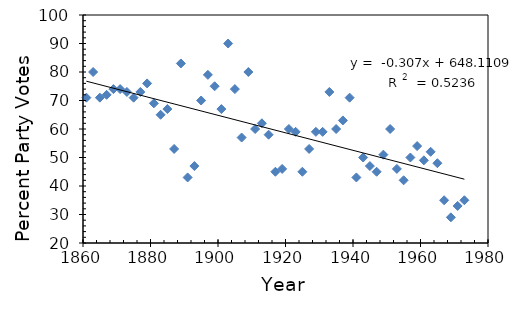
| Category | Series 0 |
|---|---|
| 1861.0 | 71 |
| 1863.0 | 80 |
| 1865.0 | 71 |
| 1867.0 | 72 |
| 1869.0 | 74 |
| 1871.0 | 74 |
| 1873.0 | 73 |
| 1875.0 | 71 |
| 1877.0 | 73 |
| 1879.0 | 76 |
| 1881.0 | 69 |
| 1883.0 | 65 |
| 1885.0 | 67 |
| 1887.0 | 53 |
| 1889.0 | 83 |
| 1891.0 | 43 |
| 1893.0 | 47 |
| 1895.0 | 70 |
| 1897.0 | 79 |
| 1899.0 | 75 |
| 1901.0 | 67 |
| 1903.0 | 90 |
| 1905.0 | 74 |
| 1907.0 | 57 |
| 1909.0 | 80 |
| 1911.0 | 60 |
| 1913.0 | 62 |
| 1915.0 | 58 |
| 1917.0 | 45 |
| 1919.0 | 46 |
| 1921.0 | 60 |
| 1923.0 | 59 |
| 1925.0 | 45 |
| 1927.0 | 53 |
| 1929.0 | 59 |
| 1931.0 | 59 |
| 1933.0 | 73 |
| 1935.0 | 60 |
| 1937.0 | 63 |
| 1939.0 | 71 |
| 1941.0 | 43 |
| 1943.0 | 50 |
| 1945.0 | 47 |
| 1947.0 | 45 |
| 1949.0 | 51 |
| 1951.0 | 60 |
| 1953.0 | 46 |
| 1955.0 | 42 |
| 1957.0 | 50 |
| 1959.0 | 54 |
| 1961.0 | 49 |
| 1963.0 | 52 |
| 1965.0 | 48 |
| 1967.0 | 35 |
| 1969.0 | 29 |
| 1971.0 | 33 |
| 1973.0 | 35 |